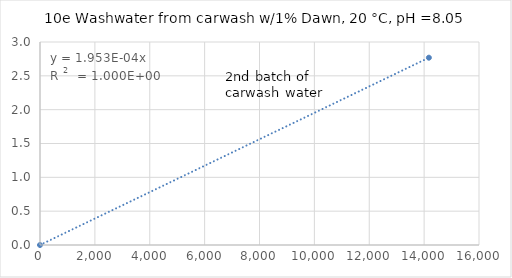
| Category | Series 0 |
|---|---|
| 0.0 | 0 |
| 14173.228346456692 | 2.768 |